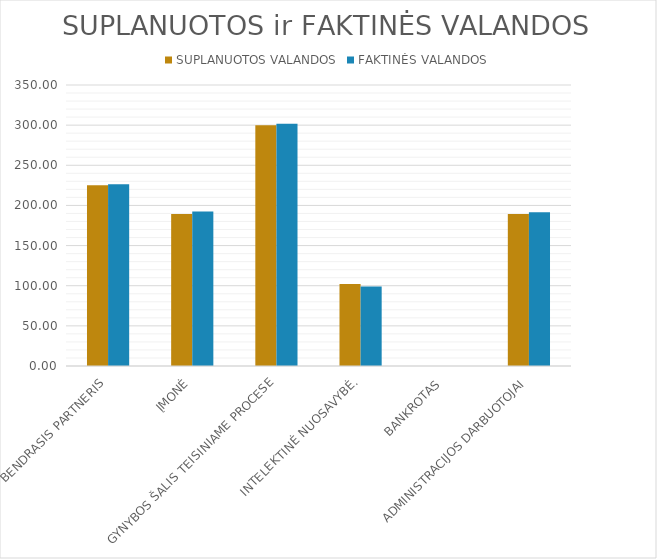
| Category | SUPLANUOTOS VALANDOS | FAKTINĖS VALANDOS |
|---|---|---|
| BENDRASIS PARTNERIS | 225 | 226.5 |
| ĮMONĖ | 189.286 | 192.5 |
| GYNYBOS ŠALIS TEISINIAME PROCESE | 300 | 301.714 |
| INTELEKTINĖ NUOSAVYBĖ. | 102.143 | 99 |
| BANKROTAS | 0 | 0 |
| ADMINISTRACIJOS DARBUOTOJAI | 189.286 | 191.429 |